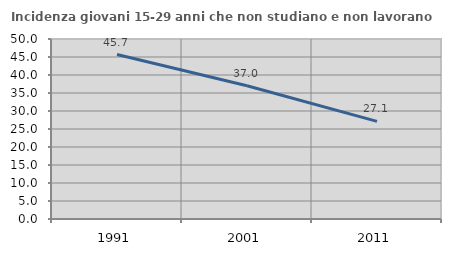
| Category | Incidenza giovani 15-29 anni che non studiano e non lavorano  |
|---|---|
| 1991.0 | 45.694 |
| 2001.0 | 37.021 |
| 2011.0 | 27.119 |